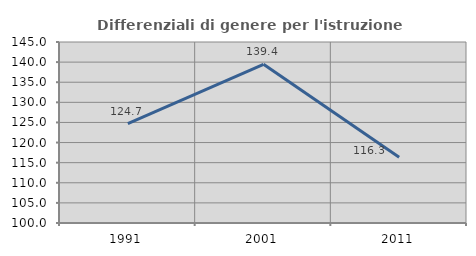
| Category | Differenziali di genere per l'istruzione superiore |
|---|---|
| 1991.0 | 124.733 |
| 2001.0 | 139.441 |
| 2011.0 | 116.323 |